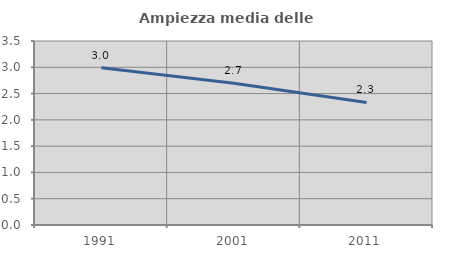
| Category | Ampiezza media delle famiglie |
|---|---|
| 1991.0 | 2.99 |
| 2001.0 | 2.695 |
| 2011.0 | 2.332 |